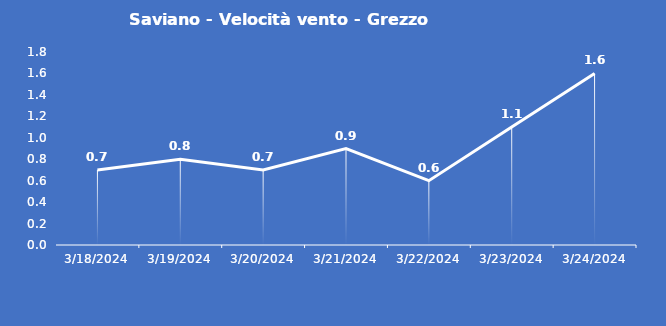
| Category | Saviano - Velocità vento - Grezzo (m/s) |
|---|---|
| 3/18/24 | 0.7 |
| 3/19/24 | 0.8 |
| 3/20/24 | 0.7 |
| 3/21/24 | 0.9 |
| 3/22/24 | 0.6 |
| 3/23/24 | 1.1 |
| 3/24/24 | 1.6 |